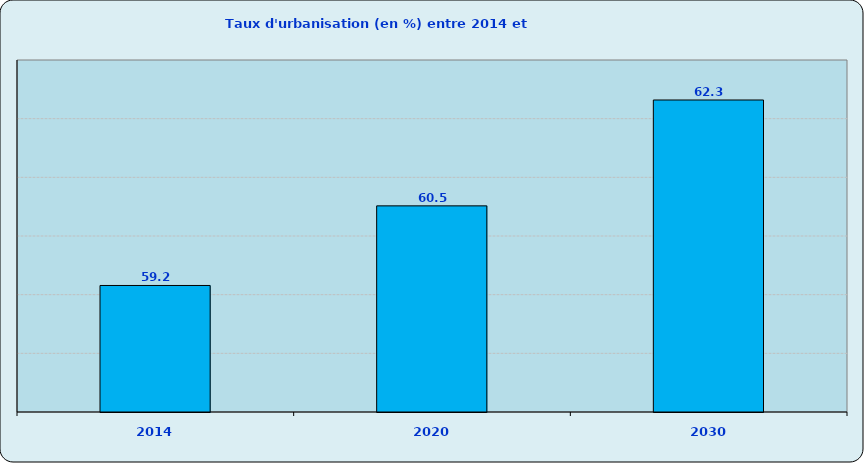
| Category | Taux d'urbanisation |
|---|---|
| 2014.0 | 59.157 |
| 2020.0 | 60.514 |
| 2030.0 | 62.318 |